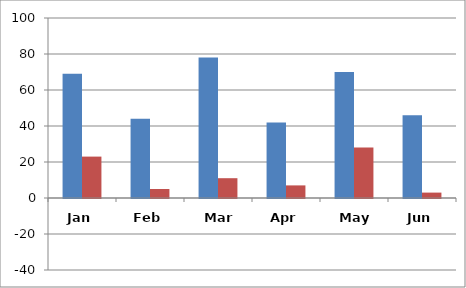
| Category | Met | Not Met |
|---|---|---|
| Jan | 69 | 23 |
| Feb | 44 | 5 |
| Mar | 78 | 11 |
| Apr | 42 | 7 |
| May | 70 | 28 |
| Jun | 46 | 3 |